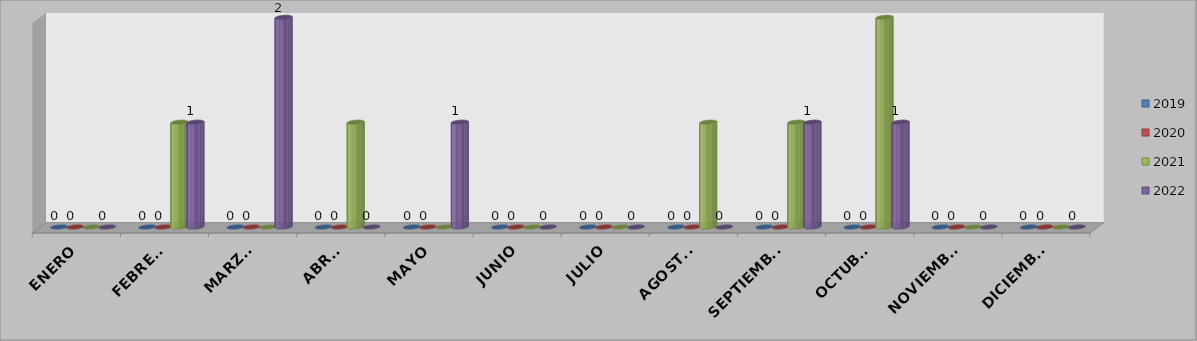
| Category | 2019 | 2020 | 2021 | 2022 |
|---|---|---|---|---|
| ENERO | 0 | 0 | 0 | 0 |
| FEBRERO | 0 | 0 | 1 | 1 |
| MARZO  | 0 | 0 | 0 | 2 |
| ABRIL | 0 | 0 | 1 | 0 |
| MAYO | 0 | 0 | 0 | 1 |
| JUNIO | 0 | 0 | 0 | 0 |
| JULIO | 0 | 0 | 0 | 0 |
| AGOSTO | 0 | 0 | 1 | 0 |
| SEPTIEMBRE | 0 | 0 | 1 | 1 |
| OCTUBRE | 0 | 0 | 2 | 1 |
| NOVIEMBRE | 0 | 0 | 0 | 0 |
| DICIEMBRE | 0 | 0 | 0 | 0 |